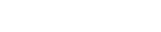
| Category | Series 0 |
|---|---|
| 0 | 0.004 |
| 1 | 0.006 |
| 2 | 0.004 |
| 3 | 0.005 |
| 4 | 0.004 |
| 5 | 0.003 |
| 6 | 0.004 |
| 7 | 0.003 |
| 8 | 0.004 |
| 9 | 0.002 |
| 10 | 0.004 |
| 11 | 0.004 |